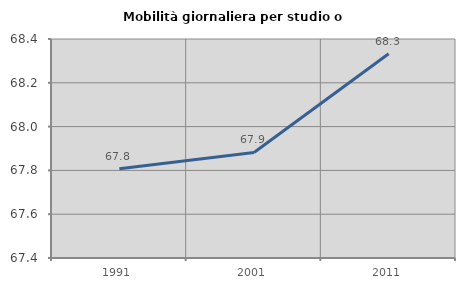
| Category | Mobilità giornaliera per studio o lavoro |
|---|---|
| 1991.0 | 67.807 |
| 2001.0 | 67.882 |
| 2011.0 | 68.333 |